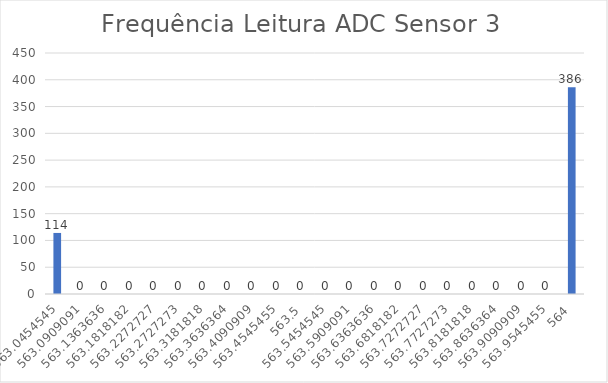
| Category | Series 0 |
|---|---|
| 563.0454545454545 | 114 |
| 563.0909090909091 | 0 |
| 563.1363636363636 | 0 |
| 563.1818181818181 | 0 |
| 563.2272727272727 | 0 |
| 563.2727272727273 | 0 |
| 563.3181818181819 | 0 |
| 563.3636363636364 | 0 |
| 563.4090909090909 | 0 |
| 563.4545454545455 | 0 |
| 563.5 | 0 |
| 563.5454545454545 | 0 |
| 563.5909090909091 | 0 |
| 563.6363636363636 | 0 |
| 563.6818181818181 | 0 |
| 563.7272727272727 | 0 |
| 563.7727272727273 | 0 |
| 563.8181818181819 | 0 |
| 563.8636363636364 | 0 |
| 563.9090909090909 | 0 |
| 563.9545454545455 | 0 |
| 564.0 | 386 |